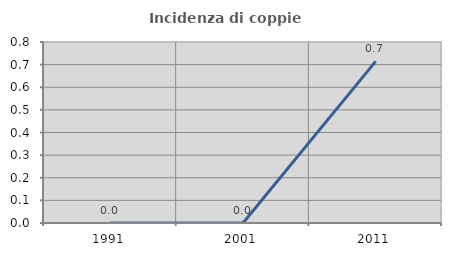
| Category | Incidenza di coppie miste |
|---|---|
| 1991.0 | 0 |
| 2001.0 | 0 |
| 2011.0 | 0.714 |